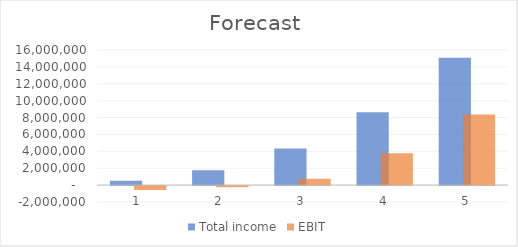
| Category | Total income | EBIT |
|---|---|---|
| 1.0 | 512494.433 | -465608.037 |
| 2.0 | 1766611.723 | -131474.631 |
| 3.0 | 4341554.408 | 744882.057 |
| 4.0 | 8621270.185 | 3785252.625 |
| 5.0 | 15086499.134 | 8353282.831 |